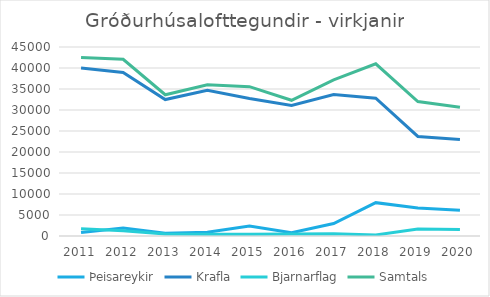
| Category | Þeisareykir | Krafla | Bjarnarflag | Samtals |
|---|---|---|---|---|
| 2011 | 827 | 39983 | 1717 | 42527 |
| 2012 | 1888 | 38954 | 1231 | 42073 |
| 2013 | 672 | 32482 | 475 | 33629 |
| 2014 | 920 | 34670 | 396 | 35986 |
| 2015 | 2370 | 32758 | 437 | 35565 |
| 2016 | 770 | 31077 | 467 | 32314 |
| 2017 | 2972 | 33672 | 527 | 37171 |
| 2018 | 7937 | 32811 | 246 | 40994 |
| 2019 | 6672.5 | 23699 | 1638 | 32009.5 |
| 2020 | 6123 | 22997 | 1547 | 30667 |